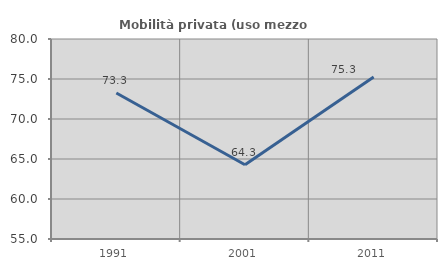
| Category | Mobilità privata (uso mezzo privato) |
|---|---|
| 1991.0 | 73.256 |
| 2001.0 | 64.286 |
| 2011.0 | 75.258 |